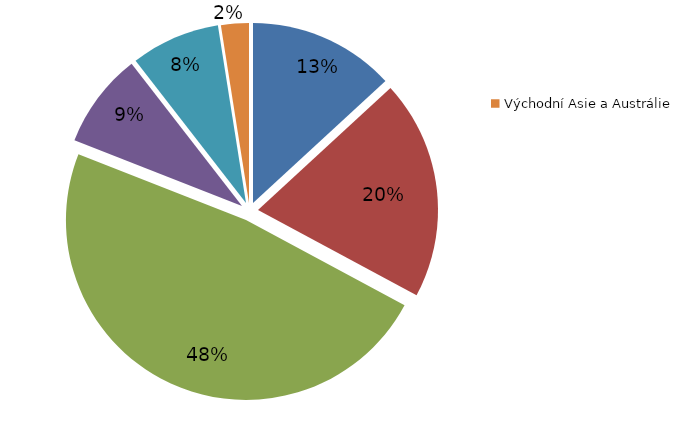
| Category | Series 0 |
|---|---|
| Severní Amerika | 217.5 |
| Střední a Jižní Amerika | 325.4 |
| Střední východ | 795 |
| Evropa, Rusko a centrální Asie | 141.1 |
| Afrika | 132.4 |
| Východní Asie a Austrálie | 41.3 |